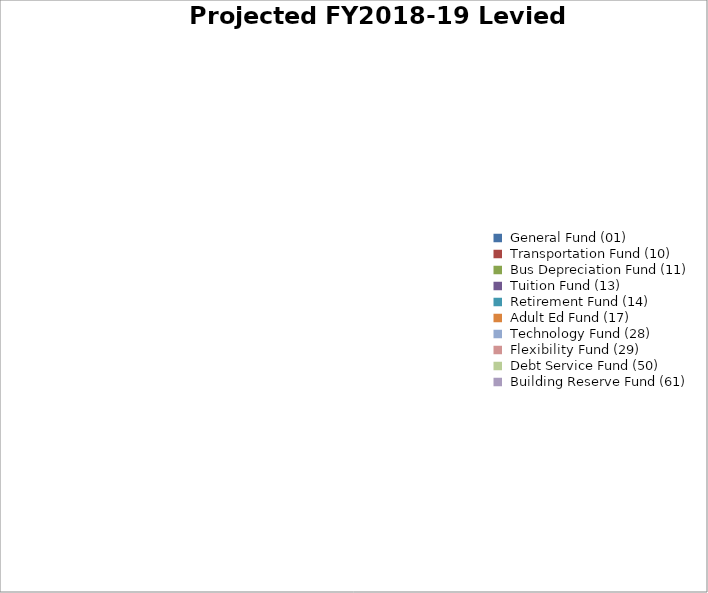
| Category | Series 0 |
|---|---|
| General Fund (01) | 0 |
| Transportation Fund (10) | 0 |
| Bus Depreciation Fund (11) | 0 |
| Tuition Fund (13) | 0 |
| Retirement Fund (14) | 0 |
| Adult Ed Fund (17) | 0 |
| Technology Fund (28) | 0 |
| Flexibility Fund (29) | 0 |
| Debt Service Fund (50)  | 0 |
| Building Reserve Fund (61) | 0 |